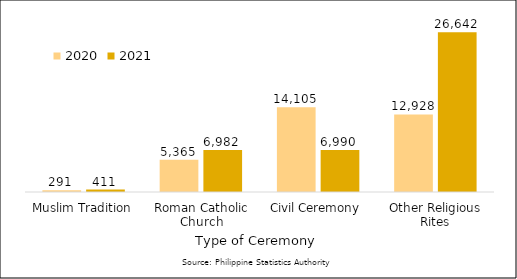
| Category | 2020 | 2021 |
|---|---|---|
| Muslim Tradition | 291 | 411 |
| Roman Catholic Church | 5365 | 6982 |
| Civil Ceremony | 14105 | 6990 |
| Other Religious Rites | 12928 | 26642 |